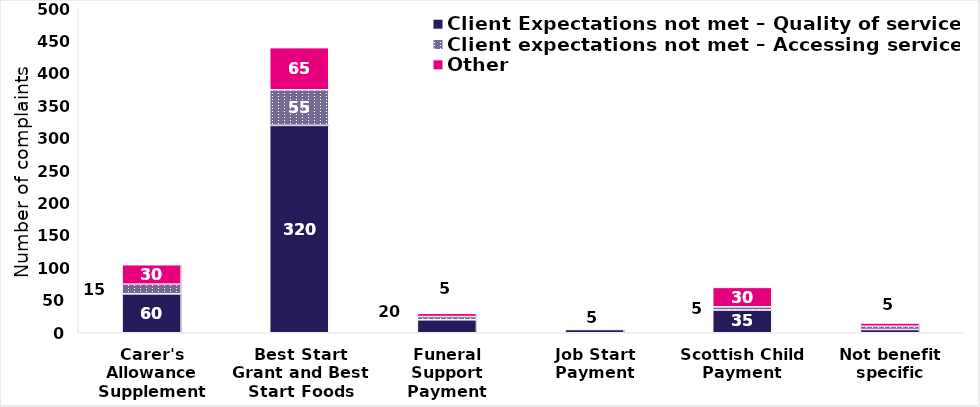
| Category | Client Expectations not met – Quality of service | Client expectations not met – Accessing services | Other |
|---|---|---|---|
| Carer's Allowance Supplement | 60 | 15 | 30 |
| Best Start Grant and Best Start Foods | 320 | 55 | 65 |
| Funeral Support Payment | 20 | 5 | 5 |
| Job Start Payment | 5 | 0 | 0 |
| Scottish Child Payment | 35 | 5 | 30 |
| Not benefit specific | 5 | 5 | 5 |